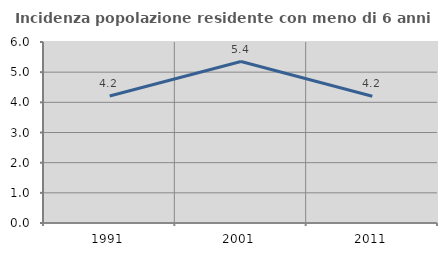
| Category | Incidenza popolazione residente con meno di 6 anni |
|---|---|
| 1991.0 | 4.211 |
| 2001.0 | 5.353 |
| 2011.0 | 4.204 |